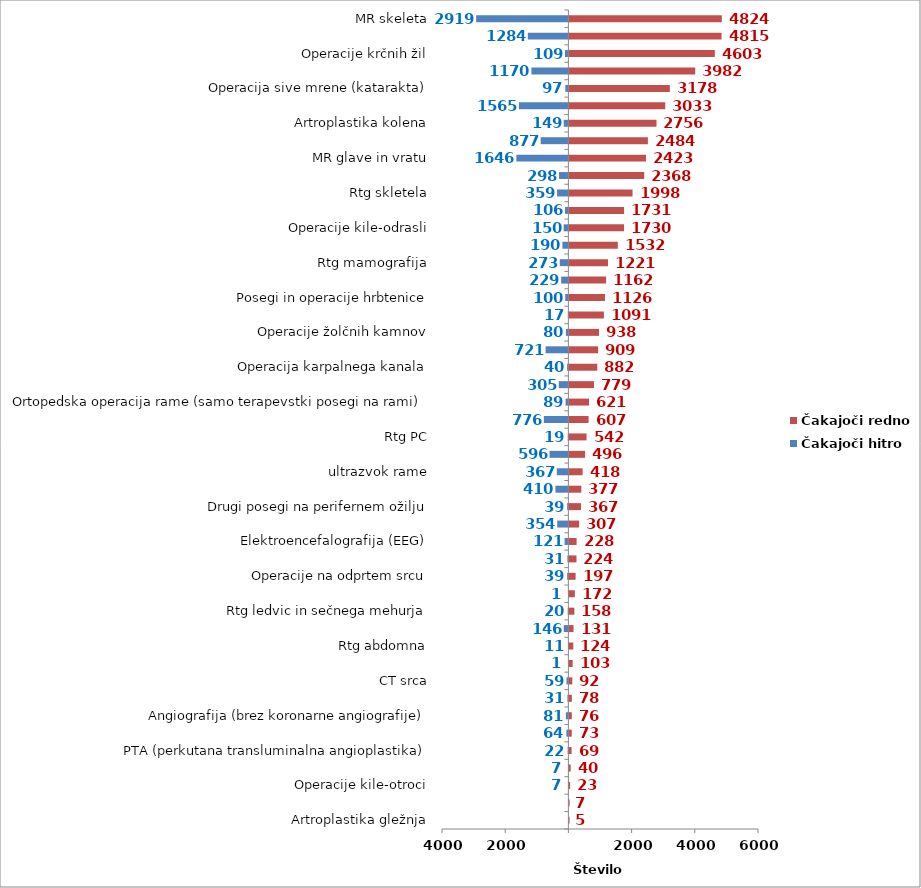
| Category | Čakajoči hitro | Čakajoči redno |
|---|---|---|
| Artroplastika gležnja | 0 | 5 |
| Sklerozacija krčnih žil | 0 | 7 |
| Operacije kile-otroci | -7 | 23 |
| Posegi na arterijah (brez PTA) | -7 | 40 |
| PTA (perkutana transluminalna angioplastika) | -22 | 69 |
| MR angiografije | -64 | 73 |
| Angiografija (brez koronarne angiografije) | -81 | 76 |
| MR srca | -31 | 78 |
| CT srca | -59 | 92 |
| Operacija ščitnice (tudi obščitnice) | -1 | 103 |
| Rtg abdomna | -11 | 124 |
| MR toraks in abdomen | -146 | 131 |
| Rtg ledvic in sečnega mehurja | -20 | 158 |
| Posegi na ušesu in mastoidu | -1 | 172 |
| Operacije na odprtem srcu | -39 | 197 |
| Rtg glave | -31 | 224 |
| Elektroencefalografija (EEG) | -121 | 228 |
| CT skeleta | -354 | 307 |
| Drugi posegi na perifernem ožilju | -39 | 367 |
| CT angiografije | -410 | 377 |
| ultrazvok rame | -367 | 418 |
| Koronarna angiografija in PTCA | -596 | 496 |
| Rtg PC | -19 | 542 |
| CT toraks in abdomen | -776 | 607 |
| Ortopedska operacija rame (samo terapevstki posegi na rami) | -89 | 621 |
| Rtg hrbtenice | -305 | 779 |
| Operacija karpalnega kanala | -40 | 882 |
| CT glave in vratu | -721 | 909 |
| Operacije žolčnih kamnov | -80 | 938 |
| Posegi in operacije nosu in obnosnih votlin | -17 | 1091 |
| Posegi in operacije hrbtenice | -100 | 1126 |
| ultrazvok dojke | -229 | 1162 |
| Rtg mamografija | -273 | 1221 |
| Terapevtske artroskopije (kolenske križne vezi, kolena) | -190 | 1532 |
| Operacije kile-odrasli | -150 | 1730 |
| Posegi in operacije v ustih, grlu in žrelu | -106 | 1731 |
| Rtg skletela | -359 | 1998 |
| Artroplastika kolka (protetika, endoproteza) | -298 | 2368 |
| MR glave in vratu | -1646 | 2423 |
| ultrazvok vratnih žil | -877 | 2484 |
| Artroplastika kolena | -149 | 2756 |
| Elektromiografija (EMG) | -1565 | 3033 |
| Operacija sive mrene (katarakta) | -97 | 3178 |
| ultrazvok mehkih tkiv (mišica, tetiva, sklep, skrotum, vrat, kolki novorojenčki) | -1170 | 3982 |
| Operacije krčnih žil | -109 | 4603 |
| ultrazvok srca | -1284 | 4815 |
| MR skeleta | -2919 | 4824 |